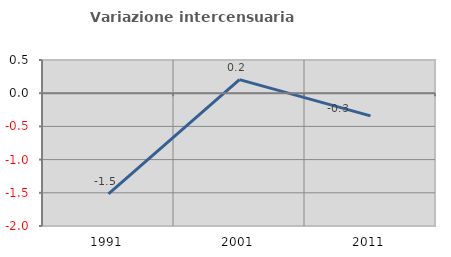
| Category | Variazione intercensuaria annua |
|---|---|
| 1991.0 | -1.515 |
| 2001.0 | 0.204 |
| 2011.0 | -0.342 |